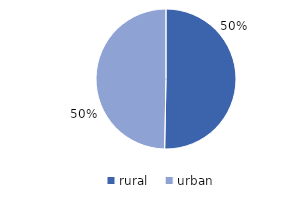
| Category | Series 0 |
|---|---|
| rural | 50.3 |
| urban | 49.7 |